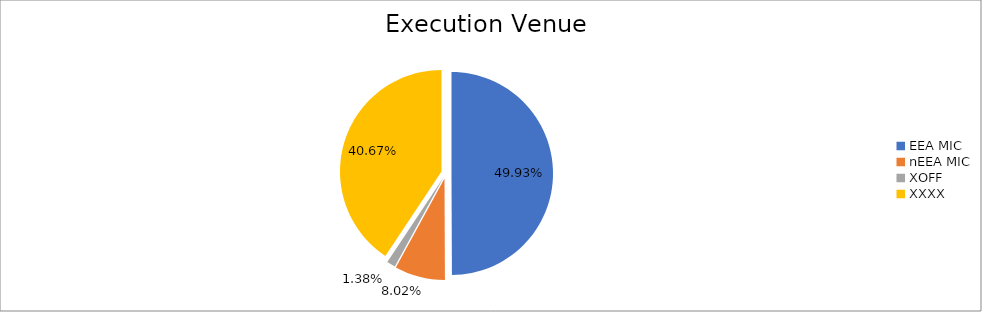
| Category | Series 0 |
|---|---|
| EEA MIC | 6362076.935 |
| nEEA MIC | 1022169.3 |
| XOFF | 175649.014 |
| XXXX | 5181317.298 |